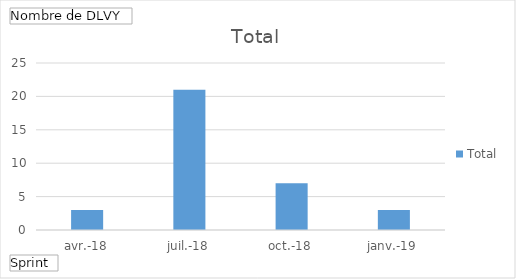
| Category | Total |
|---|---|
| avr.-18 | 3 |
| juil.-18 | 21 |
| oct.-18 | 7 |
| janv.-19 | 3 |